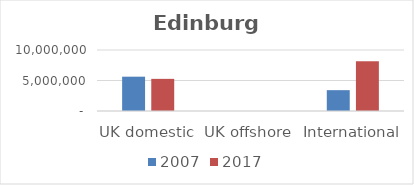
| Category | 2007 | 2017 |
|---|---|---|
| UK domestic | 5625747 | 5268155 |
| UK offshore | 0 | 0 |
| International | 3416393 | 8140507 |